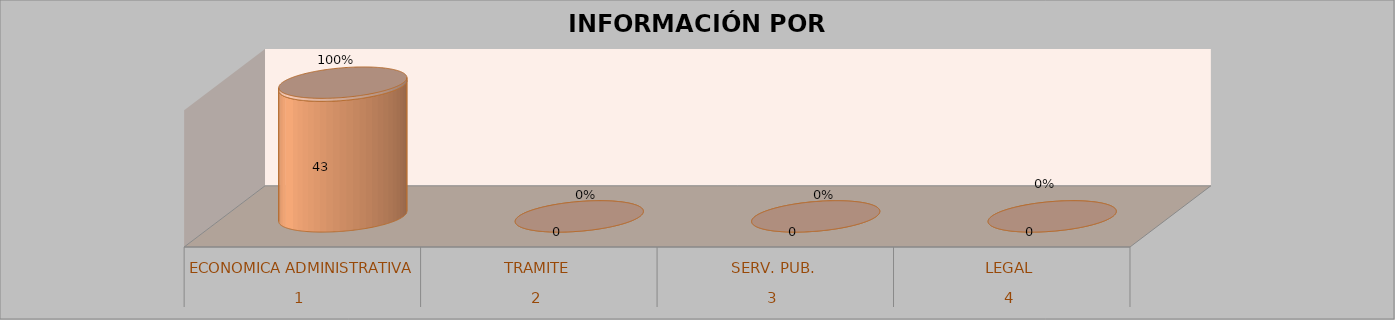
| Category | Series 0 | Series 1 | Series 2 | Series 3 |
|---|---|---|---|---|
| 0 |  |  | 43 | 1 |
| 1 |  |  | 0 | 0 |
| 2 |  |  | 0 | 0 |
| 3 |  |  | 0 | 0 |